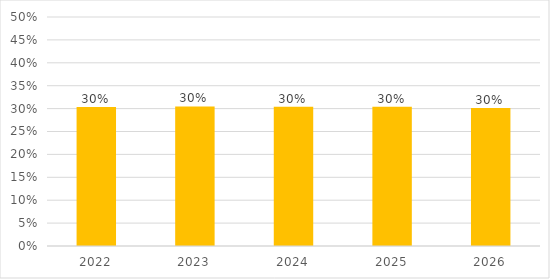
| Category | Payroll % |
|---|---|
| 2022.0 | 0.303 |
| 2023.0 | 0.305 |
| 2024.0 | 0.304 |
| 2025.0 | 0.304 |
| 2026.0 | 0.301 |